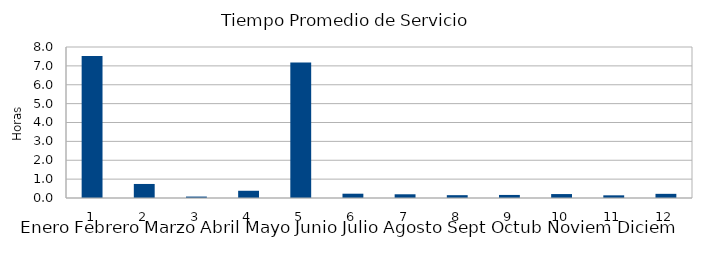
| Category | Series 0 |
|---|---|
| 0 | 7.522 |
| 1 | 0.744 |
| 2 | 0.076 |
| 3 | 0.383 |
| 4 | 7.175 |
| 5 | 0.228 |
| 6 | 0.197 |
| 7 | 0.15 |
| 8 | 0.162 |
| 9 | 0.209 |
| 10 | 0.142 |
| 11 | 0.221 |